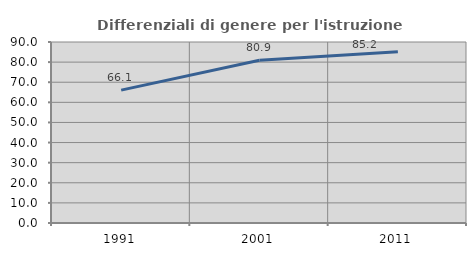
| Category | Differenziali di genere per l'istruzione superiore |
|---|---|
| 1991.0 | 66.067 |
| 2001.0 | 80.925 |
| 2011.0 | 85.207 |